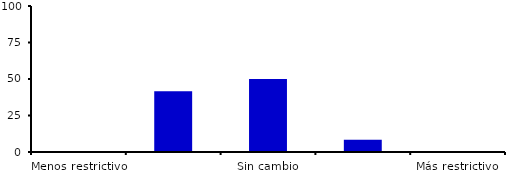
| Category | Series 0 |
|---|---|
| Menos restrictivo | 0 |
| Moderadamente menos restrictivo | 41.667 |
| Sin cambio | 50 |
| Moderadamente más restrictivo | 8.333 |
| Más restrictivo | 0 |